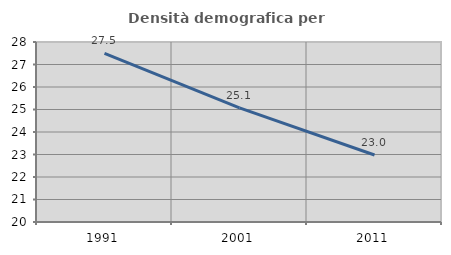
| Category | Densità demografica |
|---|---|
| 1991.0 | 27.495 |
| 2001.0 | 25.07 |
| 2011.0 | 22.976 |